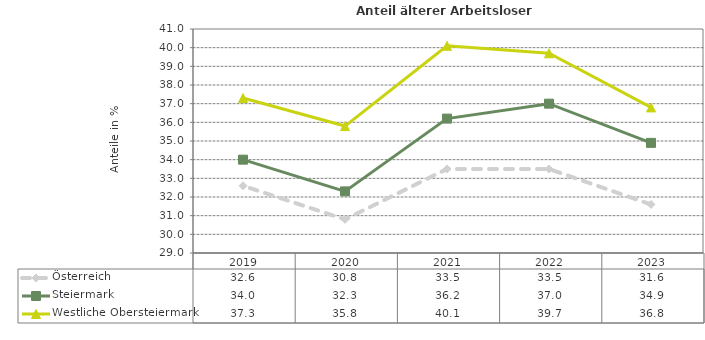
| Category | Österreich | Steiermark | Westliche Obersteiermark |
|---|---|---|---|
| 2023.0 | 31.6 | 34.9 | 36.8 |
| 2022.0 | 33.5 | 37 | 39.7 |
| 2021.0 | 33.5 | 36.2 | 40.1 |
| 2020.0 | 30.8 | 32.3 | 35.8 |
| 2019.0 | 32.6 | 34 | 37.3 |